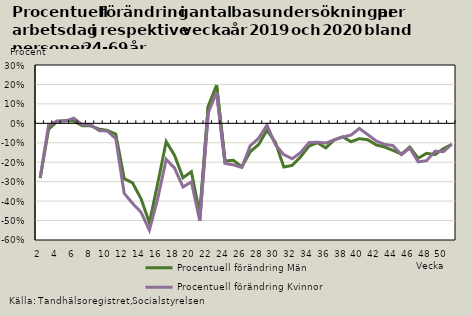
| Category | Procentuell förändring |
|---|---|
| 2.0 | -0.277 |
| 3.0 | -0.01 |
| 4.0 | 0.012 |
| 5.0 | 0.012 |
| 6.0 | 0.027 |
| 7.0 | -0.007 |
| 8.0 | -0.007 |
| 9.0 | -0.038 |
| 10.0 | -0.04 |
| 11.0 | -0.079 |
| 12.0 | -0.36 |
| 13.0 | -0.412 |
| 14.0 | -0.457 |
| 15.0 | -0.549 |
| 16.0 | -0.386 |
| 17.0 | -0.185 |
| 18.0 | -0.231 |
| 19.0 | -0.327 |
| 20.0 | -0.301 |
| 21.0 | -0.502 |
| 22.0 | 0.054 |
| 23.0 | 0.159 |
| 24.0 | -0.206 |
| 25.0 | -0.214 |
| 26.0 | -0.227 |
| 27.0 | -0.116 |
| 28.0 | -0.077 |
| 29.0 | -0.009 |
| 30.0 | -0.11 |
| 31.0 | -0.161 |
| 32.0 | -0.182 |
| 33.0 | -0.15 |
| 34.0 | -0.099 |
| 35.0 | -0.097 |
| 36.0 | -0.102 |
| 37.0 | -0.085 |
| 38.0 | -0.071 |
| 39.0 | -0.06 |
| 40.0 | -0.026 |
| 41.0 | -0.058 |
| 42.0 | -0.091 |
| 43.0 | -0.109 |
| 44.0 | -0.115 |
| 45.0 | -0.161 |
| 46.0 | -0.127 |
| 47.0 | -0.198 |
| 48.0 | -0.192 |
| 49.0 | -0.144 |
| 50.0 | -0.146 |
| 51.0 | -0.106 |